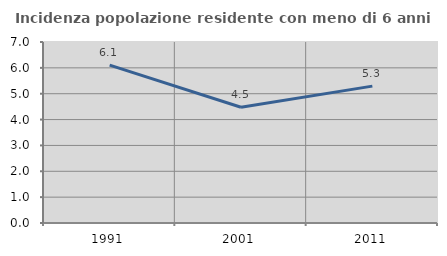
| Category | Incidenza popolazione residente con meno di 6 anni |
|---|---|
| 1991.0 | 6.105 |
| 2001.0 | 4.475 |
| 2011.0 | 5.294 |